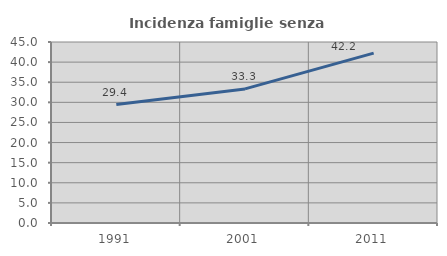
| Category | Incidenza famiglie senza nuclei |
|---|---|
| 1991.0 | 29.45 |
| 2001.0 | 33.333 |
| 2011.0 | 42.244 |